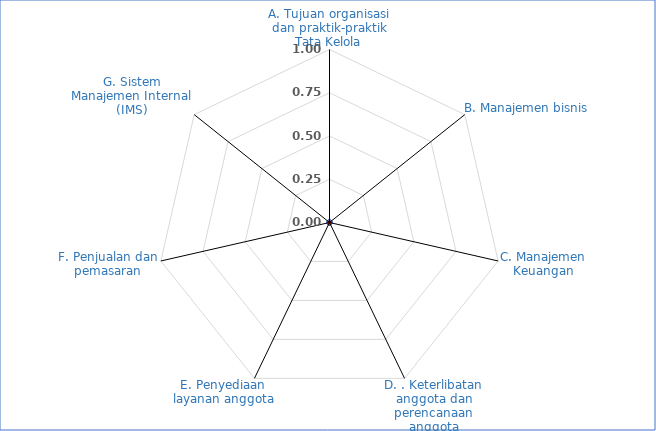
| Category | Series 0 |
|---|---|
| A. Tujuan organisasi dan praktik-praktik Tata Kelola | 0 |
| B. Manajemen bisnis | 0 |
| C. Manajemen Keuangan | 0 |
| D. . Keterlibatan anggota dan perencanaan anggota | 0 |
| E. Penyediaan  layanan anggota | 0 |
| F. Penjualan dan pemasaran | 0 |
| G. Sistem Manajemen Internal (IMS) | 0 |